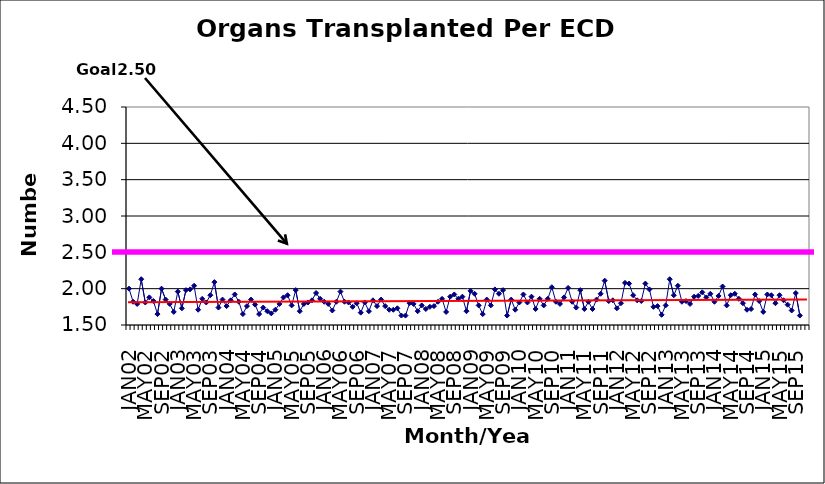
| Category | Series 0 |
|---|---|
| JAN02 | 2 |
| FEB02 | 1.82 |
| MAR02 | 1.79 |
| APR02 | 2.13 |
| MAY02 | 1.81 |
| JUN02 | 1.88 |
| JUL02 | 1.83 |
| AUG02 | 1.65 |
| SEP02 | 2 |
| OCT02 | 1.85 |
| NOV02 | 1.79 |
| DEC02 | 1.68 |
| JAN03 | 1.96 |
| FEB03 | 1.73 |
| MAR03 | 1.98 |
| APR03 | 1.99 |
| MAY03 | 2.04 |
| JUN03 | 1.71 |
| JUL03 | 1.86 |
| AUG03 | 1.81 |
| SEP03 | 1.91 |
| OCT03 | 2.09 |
| NOV03 | 1.74 |
| DEC03 | 1.85 |
| JAN04 | 1.76 |
| FEB04 | 1.84 |
| MAR04 | 1.92 |
| APR04 | 1.82 |
| MAY04 | 1.65 |
| JUN04 | 1.76 |
| JUL04 | 1.85 |
| AUG04 | 1.78 |
| SEP04 | 1.65 |
| OCT04 | 1.74 |
| NOV04 | 1.69 |
| DEC04 | 1.66 |
| JAN05 | 1.71 |
| FEB05 | 1.79 |
| MAR05 | 1.88 |
| APR05 | 1.91 |
| MAY05 | 1.77 |
| JUN05 | 1.98 |
| JUL05 | 1.69 |
| AUG05 | 1.79 |
| SEP05 | 1.81 |
| OCT05 | 1.84 |
| NOV05 | 1.94 |
| DEC05 | 1.86 |
| JAN06 | 1.82 |
| FEB06 | 1.79 |
| MAR06 | 1.7 |
| APR06 | 1.82 |
| MAY06 | 1.96 |
| JUN06 | 1.82 |
| JUL06 | 1.81 |
| AUG06 | 1.75 |
| SEP06 | 1.8 |
| OCT06 | 1.67 |
| NOV06 | 1.81 |
| DEC06 | 1.69 |
| JAN07 | 1.84 |
| FEB07 | 1.76 |
| MAR07 | 1.85 |
| APR07 | 1.76 |
| MAY07 | 1.71 |
| JUN07 | 1.71 |
| JUL07 | 1.73 |
| AUG07 | 1.63 |
| SEP07 | 1.63 |
| OCT07 | 1.8 |
| NOV07 | 1.79 |
| DEC07 | 1.69 |
| JAN08 | 1.77 |
| FEB08 | 1.72 |
| MAR08 | 1.75 |
| APR08 | 1.76 |
| MAY08 | 1.82 |
| JUN08 | 1.86 |
| JUL08 | 1.68 |
| AUG08 | 1.89 |
| SEP08 | 1.92 |
| OCT08 | 1.86 |
| NOV08 | 1.89 |
| DEC08 | 1.69 |
| JAN09 | 1.97 |
| FEB09 | 1.93 |
| MAR09 | 1.77 |
| APR09 | 1.65 |
| MAY09 | 1.85 |
| JUN09 | 1.77 |
| JUL09 | 1.99 |
| AUG09 | 1.93 |
| SEP09 | 1.98 |
| OCT09 | 1.63 |
| NOV09 | 1.85 |
| DEC09 | 1.71 |
| JAN10 | 1.81 |
| FEB10 | 1.92 |
| MAR10 | 1.81 |
| APR10 | 1.89 |
| MAY10 | 1.72 |
| JUN10 | 1.86 |
| JUL10 | 1.77 |
| AUG10 | 1.86 |
| SEP10 | 2.02 |
| OCT10 | 1.82 |
| NOV10 | 1.79 |
| DEC10 | 1.88 |
| JAN11 | 2.01 |
| FEB11 | 1.82 |
| MAR11 | 1.74 |
| APR11 | 1.98 |
| MAY11 | 1.72 |
| JUN11 | 1.82 |
| JUL11 | 1.72 |
| AUG11 | 1.85 |
| SEP11 | 1.93 |
| OCT11 | 2.11 |
| NOV11 | 1.83 |
| DEC11 | 1.84 |
| JAN12 | 1.73 |
| FEB12 | 1.8 |
| MAR12 | 2.08 |
| APR12 | 2.07 |
| MAY12 | 1.91 |
| JUN12 | 1.84 |
| JUL12 | 1.83 |
| AUG12 | 2.07 |
| SEP12 | 1.99 |
| OCT12 | 1.75 |
| NOV12 | 1.76 |
| DEC12 | 1.64 |
| JAN13 | 1.77 |
| FEB13 | 2.13 |
| MAR13 | 1.91 |
| APR13 | 2.04 |
| MAY13 | 1.82 |
| JUN13 | 1.83 |
| JUL13 | 1.79 |
| AUG13 | 1.89 |
| SEP13 | 1.9 |
| OCT13 | 1.95 |
| NOV13 | 1.88 |
| DEC13 | 1.93 |
| JAN14 | 1.82 |
| FEB14 | 1.9 |
| MAR14 | 2.03 |
| APR14 | 1.77 |
| MAY14 | 1.91 |
| JUN14 | 1.93 |
| JUL14 | 1.86 |
| AUG14 | 1.8 |
| SEP14 | 1.71 |
| OCT14 | 1.72 |
| NOV14 | 1.92 |
| DEC14 | 1.83 |
| JAN15 | 1.68 |
| FEB15 | 1.92 |
| MAR15 | 1.91 |
| APR15 | 1.8 |
| MAY15 | 1.91 |
| JUN15 | 1.84 |
| JUL15 | 1.78 |
| AUG15 | 1.7 |
| SEP15 | 1.94 |
| OCT15 | 1.63 |